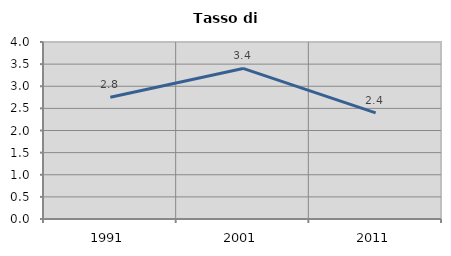
| Category | Tasso di disoccupazione   |
|---|---|
| 1991.0 | 2.751 |
| 2001.0 | 3.403 |
| 2011.0 | 2.4 |